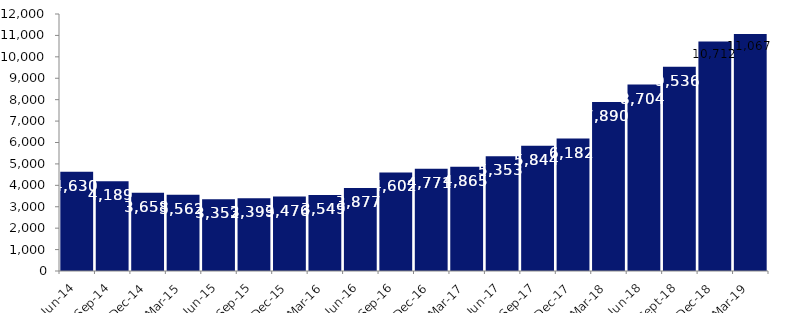
| Category | Series 0 |
|---|---|
| Jun-14 | 4630 |
| Sep-14 | 4189 |
| Dec-14 | 3658 |
| Mar-15 | 3562 |
| Jun-15 | 3352 |
| Sep-15 | 3399 |
| Dec-15 | 3476 |
| Mar-16 | 3549 |
| Jun-16 | 3877 |
| Sep-16 | 4602 |
| Dec-16 | 4771 |
| Mar-17 | 4865 |
| Jun-17 | 5353 |
| Sep-17 | 5844 |
| Dec-17 | 6182 |
| Mar-18 | 7890 |
| Jun-18 | 8704 |
| Sep-18 | 9536 |
| Dec-18 | 10712 |
| Mar-19 | 11067 |